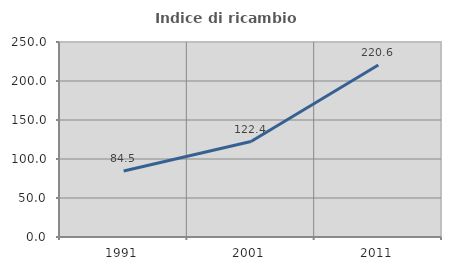
| Category | Indice di ricambio occupazionale  |
|---|---|
| 1991.0 | 84.549 |
| 2001.0 | 122.404 |
| 2011.0 | 220.588 |